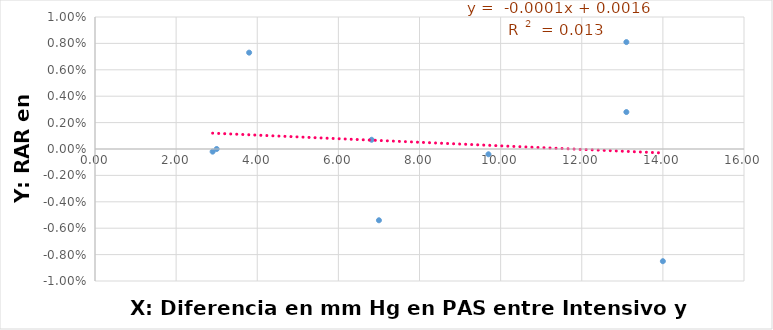
| Category | Y = RAR en InsCard |
|---|---|
| 2.9 | 0 |
| 6.82 | 0.001 |
| 7.0 | -0.005 |
| 9.7 | 0 |
| 3.8 | 0.007 |
| 13.1 | 0.003 |
| 14.0 | -0.008 |
| 13.1 | 0.008 |
| 3.0 | 0 |